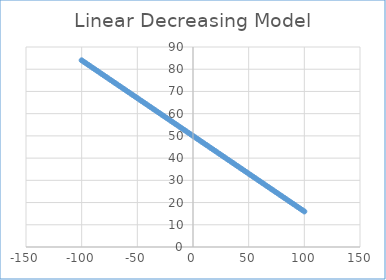
| Category | Series 0 |
|---|---|
| -100.0 | 84 |
| -98.0 | 83.32 |
| -96.0 | 82.64 |
| -94.0 | 81.96 |
| -92.0 | 81.28 |
| -90.0 | 80.6 |
| -88.0 | 79.92 |
| -86.0 | 79.24 |
| -84.0 | 78.56 |
| -82.0 | 77.88 |
| -80.0 | 77.2 |
| -78.0 | 76.52 |
| -76.0 | 75.84 |
| -74.0 | 75.16 |
| -72.0 | 74.48 |
| -70.0 | 73.8 |
| -68.0 | 73.12 |
| -66.0 | 72.44 |
| -64.0 | 71.76 |
| -62.0 | 71.08 |
| -60.0 | 70.4 |
| -58.0 | 69.72 |
| -56.0 | 69.04 |
| -54.0 | 68.36 |
| -52.0 | 67.68 |
| -50.0 | 67 |
| -48.0 | 66.32 |
| -46.0 | 65.64 |
| -44.0 | 64.96 |
| -42.0 | 64.28 |
| -40.0 | 63.6 |
| -38.0 | 62.92 |
| -36.0 | 62.24 |
| -34.0 | 61.56 |
| -32.0 | 60.88 |
| -30.0 | 60.2 |
| -28.0 | 59.52 |
| -26.0 | 58.84 |
| -24.0 | 58.16 |
| -22.0 | 57.48 |
| -20.0 | 56.8 |
| -18.0 | 56.12 |
| -16.0 | 55.44 |
| -14.0 | 54.76 |
| -12.0 | 54.08 |
| -10.0 | 53.4 |
| -8.0 | 52.72 |
| -6.0 | 52.04 |
| -4.0 | 51.36 |
| -2.0 | 50.68 |
| 0.0 | 50 |
| 2.0 | 49.32 |
| 4.0 | 48.64 |
| 6.0 | 47.96 |
| 8.0 | 47.28 |
| 10.0 | 46.6 |
| 12.0 | 45.92 |
| 14.0 | 45.24 |
| 16.0 | 44.56 |
| 18.0 | 43.88 |
| 20.0 | 43.2 |
| 22.0 | 42.52 |
| 24.0 | 41.84 |
| 26.0 | 41.16 |
| 28.0 | 40.48 |
| 30.0 | 39.8 |
| 32.0 | 39.12 |
| 34.0 | 38.44 |
| 36.0 | 37.76 |
| 38.0 | 37.08 |
| 40.0 | 36.4 |
| 42.0 | 35.72 |
| 44.0 | 35.04 |
| 46.0 | 34.36 |
| 48.0 | 33.68 |
| 50.0 | 33 |
| 52.0 | 32.32 |
| 54.0 | 31.64 |
| 56.0 | 30.96 |
| 58.0 | 30.28 |
| 60.0 | 29.6 |
| 62.0 | 28.92 |
| 64.0 | 28.24 |
| 66.0 | 27.56 |
| 68.0 | 26.88 |
| 70.0 | 26.2 |
| 72.0 | 25.52 |
| 74.0 | 24.84 |
| 76.0 | 24.16 |
| 78.0 | 23.48 |
| 80.0 | 22.8 |
| 82.0 | 22.12 |
| 84.0 | 21.44 |
| 86.0 | 20.76 |
| 88.0 | 20.08 |
| 90.0 | 19.4 |
| 92.0 | 18.72 |
| 94.0 | 18.04 |
| 96.0 | 17.36 |
| 98.0 | 16.68 |
| 100.0 | 16 |